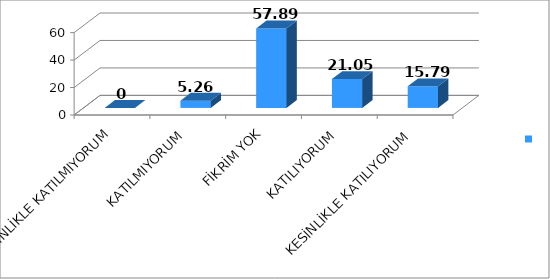
| Category | Series 0 |
|---|---|
| KESİNLİKLE KATILMIYORUM | 0 |
| KATILMIYORUM | 5.26 |
| FİKRİM YOK | 57.89 |
| KATILIYORUM | 21.05 |
| KESİNLİKLE KATILIYORUM | 15.79 |